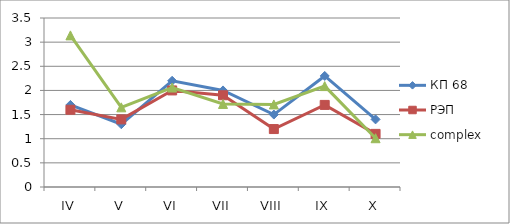
| Category | КП 68 | РЭП  | complex |
|---|---|---|---|
| IV | 1.7 | 1.6 | 3.14 |
| V | 1.3 | 1.4 | 1.65 |
| VI | 2.2 | 2 | 2.06 |
| VII | 2 | 1.9 | 1.72 |
| VIII | 1.5 | 1.2 | 1.71 |
| IX | 2.3 | 1.7 | 2.09 |
| X | 1.4 | 1.1 | 1.01 |